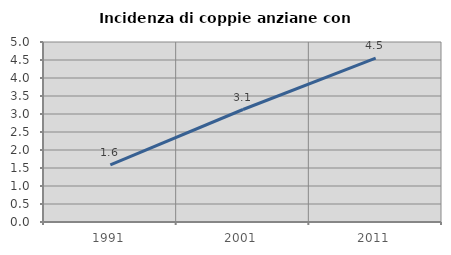
| Category | Incidenza di coppie anziane con figli |
|---|---|
| 1991.0 | 1.585 |
| 2001.0 | 3.125 |
| 2011.0 | 4.549 |